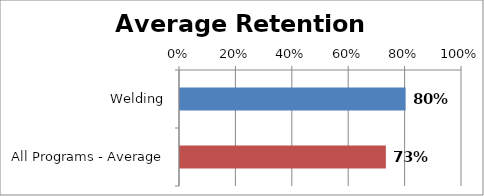
| Category | RetentionRate |
|---|---|
| Welding | 0.8 |
| All Programs - Average | 0.73 |